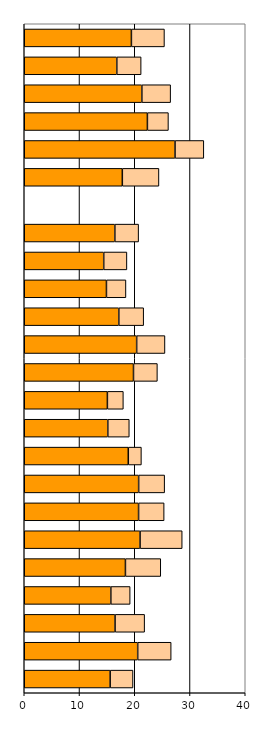
| Category | Series 0 | Series 1 |
|---|---|---|
| 0 | 15.549 | 4.139 |
| 1 | 20.534 | 6.058 |
| 2 | 16.436 | 5.354 |
| 3 | 15.672 | 3.496 |
| 4 | 18.314 | 6.395 |
| 5 | 20.964 | 7.623 |
| 6 | 20.692 | 4.625 |
| 7 | 20.706 | 4.706 |
| 8 | 18.83 | 2.374 |
| 9 | 15.124 | 3.889 |
| 10 | 15.047 | 2.891 |
| 11 | 19.773 | 4.323 |
| 12 | 20.347 | 5.12 |
| 13 | 17.118 | 4.5 |
| 14 | 14.877 | 3.53 |
| 15 | 14.386 | 4.196 |
| 16 | 16.399 | 4.3 |
| 17 | 0 | 0 |
| 18 | 17.751 | 6.627 |
| 19 | 27.289 | 5.212 |
| 20 | 22.289 | 3.805 |
| 21 | 21.286 | 5.209 |
| 22 | 16.752 | 4.403 |
| 23 | 19.394 | 5.982 |